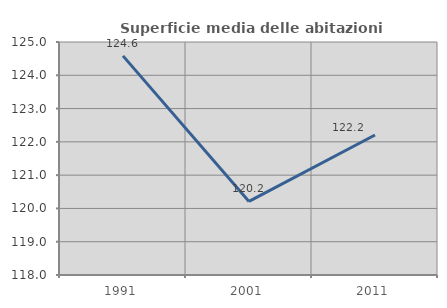
| Category | Superficie media delle abitazioni occupate |
|---|---|
| 1991.0 | 124.583 |
| 2001.0 | 120.21 |
| 2011.0 | 122.206 |